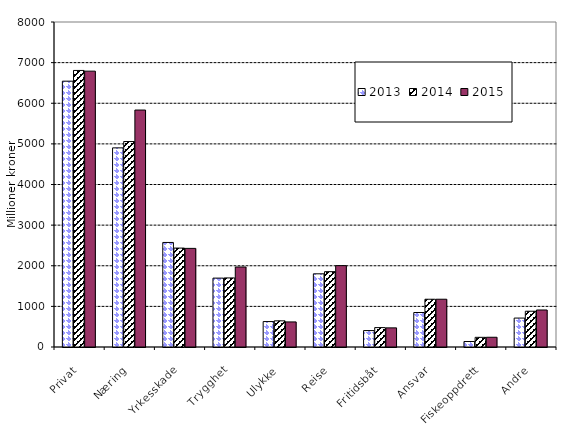
| Category | 2013 | 2014 | 2015 |
|---|---|---|---|
| Privat | 6543.143 | 6807.421 | 6790.108 |
| Næring | 4901.714 | 5057.481 | 5832.965 |
| Yrkesskade | 2573.205 | 2434.703 | 2427.398 |
| Trygghet | 1695.525 | 1700.293 | 1969.218 |
| Ulykke | 625.949 | 643.955 | 617.196 |
| Reise | 1801.514 | 1854.319 | 2002.965 |
| Fritidsbåt | 404.534 | 477.564 | 470.834 |
| Ansvar | 849.168 | 1175.414 | 1175.94 |
| Fiskeoppdrett | 134.623 | 238.075 | 239.901 |
| Andre | 712.197 | 880.462 | 910.879 |